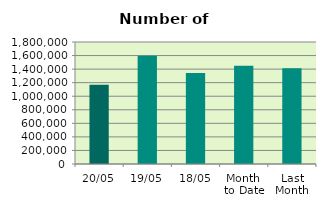
| Category | Series 0 |
|---|---|
| 20/05 | 1170290 |
| 19/05 | 1598946 |
| 18/05 | 1341170 |
| Month 
to Date | 1447992.714 |
| Last
Month | 1414476.2 |